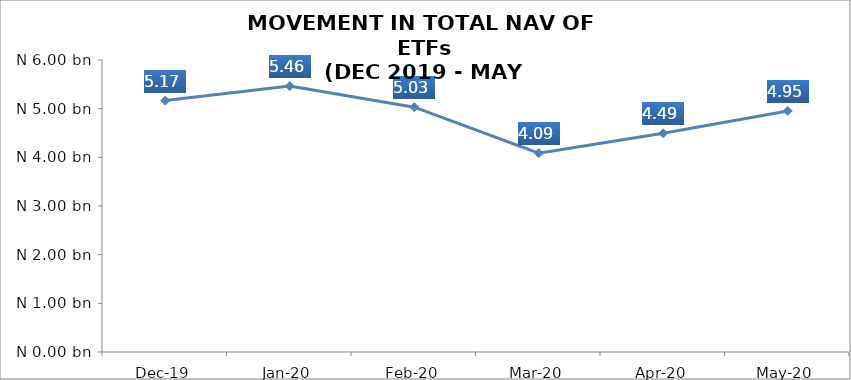
| Category | Series 0 |
|---|---|
| 2019-12-01 | 5165913992.06 |
| 2020-01-01 | 5464063863.02 |
| 2020-02-01 | 5030305629.7 |
| 2020-03-01 | 4085799334.74 |
| 2020-04-01 | 4494025633.23 |
| 2020-05-01 | 4952411842.71 |